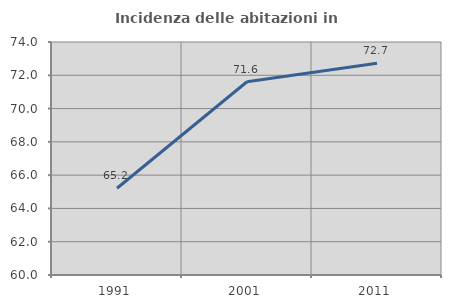
| Category | Incidenza delle abitazioni in proprietà  |
|---|---|
| 1991.0 | 65.214 |
| 2001.0 | 71.611 |
| 2011.0 | 72.725 |